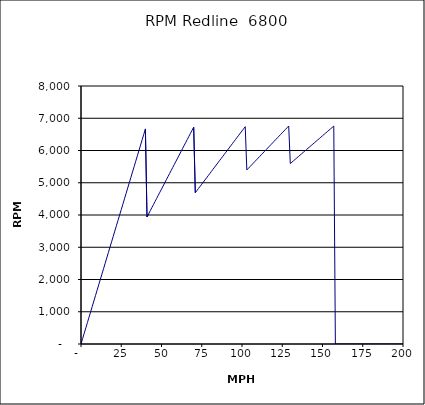
| Category | RPM Redline  6800 |
|---|---|
| 0.0 | 0 |
| 1.0 | 166.721 |
| 2.0 | 333.442 |
| 3.0 | 500.163 |
| 4.0 | 666.884 |
| 5.0 | 833.605 |
| 6.0 | 1000.326 |
| 7.0 | 1167.047 |
| 8.0 | 1333.768 |
| 9.0 | 1500.489 |
| 10.0 | 1667.21 |
| 11.0 | 1833.931 |
| 12.0 | 2000.652 |
| 13.0 | 2167.373 |
| 14.0 | 2334.094 |
| 15.0 | 2500.815 |
| 16.0 | 2667.536 |
| 17.0 | 2834.257 |
| 18.0 | 3000.978 |
| 19.0 | 3167.699 |
| 20.0 | 3334.42 |
| 21.0 | 3501.141 |
| 22.0 | 3667.862 |
| 23.0 | 3834.583 |
| 24.0 | 4001.303 |
| 25.0 | 4168.024 |
| 26.0 | 4334.745 |
| 27.0 | 4501.466 |
| 28.0 | 4668.187 |
| 29.0 | 4834.908 |
| 30.0 | 5001.629 |
| 31.0 | 5168.35 |
| 32.0 | 5335.071 |
| 33.0 | 5501.792 |
| 34.0 | 5668.513 |
| 35.0 | 5835.234 |
| 36.0 | 6001.955 |
| 37.0 | 6168.676 |
| 38.0 | 6335.397 |
| 39.0 | 6502.118 |
| 40.0 | 6668.839 |
| 41.0 | 3938.585 |
| 42.0 | 4034.648 |
| 43.0 | 4130.711 |
| 44.0 | 4226.774 |
| 45.0 | 4322.837 |
| 46.0 | 4418.9 |
| 47.0 | 4514.963 |
| 48.0 | 4611.026 |
| 49.0 | 4707.089 |
| 50.0 | 4803.152 |
| 51.0 | 4899.215 |
| 52.0 | 4995.278 |
| 53.0 | 5091.341 |
| 54.0 | 5187.404 |
| 55.0 | 5283.467 |
| 56.0 | 5379.53 |
| 57.0 | 5475.593 |
| 58.0 | 5571.656 |
| 59.0 | 5667.719 |
| 60.0 | 5763.782 |
| 61.0 | 5859.845 |
| 62.0 | 5955.908 |
| 63.0 | 6051.972 |
| 64.0 | 6148.035 |
| 65.0 | 6244.098 |
| 66.0 | 6340.161 |
| 67.0 | 6436.224 |
| 68.0 | 6532.287 |
| 69.0 | 6628.35 |
| 70.0 | 6724.413 |
| 71.0 | 4690.762 |
| 72.0 | 4756.829 |
| 73.0 | 4822.896 |
| 74.0 | 4888.963 |
| 75.0 | 4955.03 |
| 76.0 | 5021.097 |
| 77.0 | 5087.164 |
| 78.0 | 5153.232 |
| 79.0 | 5219.299 |
| 80.0 | 5285.366 |
| 81.0 | 5351.433 |
| 82.0 | 5417.5 |
| 83.0 | 5483.567 |
| 84.0 | 5549.634 |
| 85.0 | 5615.701 |
| 86.0 | 5681.768 |
| 87.0 | 5747.835 |
| 88.0 | 5813.902 |
| 89.0 | 5879.969 |
| 90.0 | 5946.036 |
| 91.0 | 6012.103 |
| 92.0 | 6078.171 |
| 93.0 | 6144.238 |
| 94.0 | 6210.305 |
| 95.0 | 6276.372 |
| 96.0 | 6342.439 |
| 97.0 | 6408.506 |
| 98.0 | 6474.573 |
| 99.0 | 6540.64 |
| 100.0 | 6606.707 |
| 101.0 | 6672.774 |
| 102.0 | 6738.841 |
| 103.0 | 5396.996 |
| 104.0 | 5449.394 |
| 105.0 | 5501.792 |
| 106.0 | 5554.19 |
| 107.0 | 5606.588 |
| 108.0 | 5658.986 |
| 109.0 | 5711.384 |
| 110.0 | 5763.782 |
| 111.0 | 5816.18 |
| 112.0 | 5868.578 |
| 113.0 | 5920.976 |
| 114.0 | 5973.374 |
| 115.0 | 6025.773 |
| 116.0 | 6078.171 |
| 117.0 | 6130.569 |
| 118.0 | 6182.967 |
| 119.0 | 6235.365 |
| 120.0 | 6287.763 |
| 121.0 | 6340.161 |
| 122.0 | 6392.559 |
| 123.0 | 6444.957 |
| 124.0 | 6497.355 |
| 125.0 | 6549.753 |
| 126.0 | 6602.151 |
| 127.0 | 6654.549 |
| 128.0 | 6706.947 |
| 129.0 | 6759.345 |
| 130.0 | 5595.36 |
| 131.0 | 5638.401 |
| 132.0 | 5681.443 |
| 133.0 | 5724.484 |
| 134.0 | 5767.525 |
| 135.0 | 5810.566 |
| 136.0 | 5853.608 |
| 137.0 | 5896.649 |
| 138.0 | 5939.69 |
| 139.0 | 5982.731 |
| 140.0 | 6025.773 |
| 141.0 | 6068.814 |
| 142.0 | 6111.855 |
| 143.0 | 6154.896 |
| 144.0 | 6197.937 |
| 145.0 | 6240.979 |
| 146.0 | 6284.02 |
| 147.0 | 6327.061 |
| 148.0 | 6370.102 |
| 149.0 | 6413.144 |
| 150.0 | 6456.185 |
| 151.0 | 6499.226 |
| 152.0 | 6542.267 |
| 153.0 | 6585.309 |
| 154.0 | 6628.35 |
| 155.0 | 6671.391 |
| 156.0 | 6714.432 |
| 157.0 | 6757.473 |
| 158.0 | 0 |
| 159.0 | 0 |
| 160.0 | 0 |
| 161.0 | 0 |
| 162.0 | 0 |
| 163.0 | 0 |
| 164.0 | 0 |
| 165.0 | 0 |
| 166.0 | 0 |
| 167.0 | 0 |
| 168.0 | 0 |
| 169.0 | 0 |
| 170.0 | 0 |
| 171.0 | 0 |
| 172.0 | 0 |
| 173.0 | 0 |
| 174.0 | 0 |
| 175.0 | 0 |
| 176.0 | 0 |
| 177.0 | 0 |
| 178.0 | 0 |
| 179.0 | 0 |
| 180.0 | 0 |
| 181.0 | 0 |
| 182.0 | 0 |
| 183.0 | 0 |
| 184.0 | 0 |
| 185.0 | 0 |
| 186.0 | 0 |
| 187.0 | 0 |
| 188.0 | 0 |
| 189.0 | 0 |
| 190.0 | 0 |
| 191.0 | 0 |
| 192.0 | 0 |
| 193.0 | 0 |
| 194.0 | 0 |
| 195.0 | 0 |
| 196.0 | 0 |
| 197.0 | 0 |
| 198.0 | 0 |
| 199.0 | 0 |
| 200.0 | 0 |